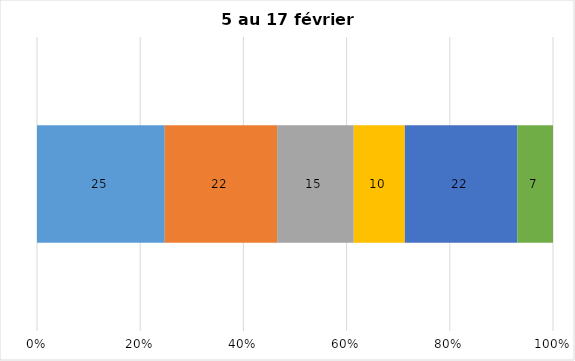
| Category | Plusieurs fois par jour | Une fois par jour | Quelques fois par semaine   | Une fois par semaine ou moins   |  Jamais   |  Je n’utilise pas les médias sociaux |
|---|---|---|---|---|---|---|
| 0 | 25 | 22 | 15 | 10 | 22 | 7 |